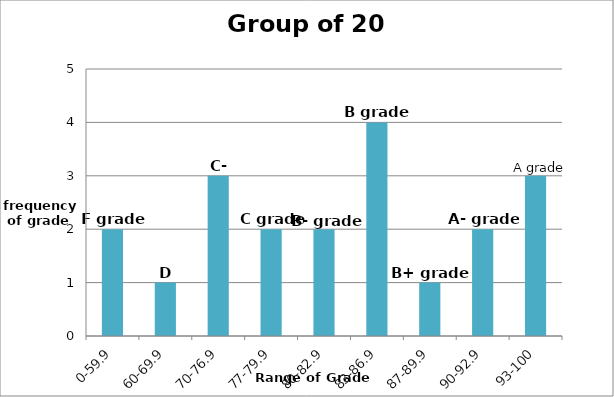
| Category | Frequency |
|---|---|
| 0-59.9 | 2 |
| 60-69.9 | 1 |
| 70-76.9 | 3 |
| 77-79.9 | 2 |
| 80-82.9 | 2 |
| 83-86.9 | 4 |
| 87-89.9 | 1 |
| 90-92.9 | 2 |
| 93-100 | 3 |